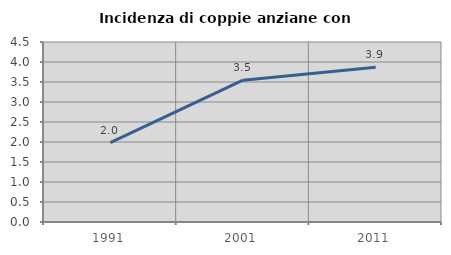
| Category | Incidenza di coppie anziane con figli |
|---|---|
| 1991.0 | 1.987 |
| 2001.0 | 3.544 |
| 2011.0 | 3.867 |